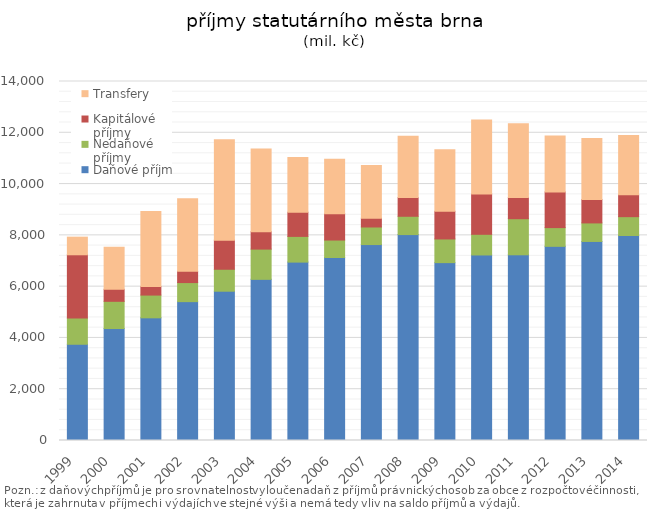
| Category | Daňové příjmy | Nedaňové příjmy | Kapitálové příjmy | Transfery |
|---|---|---|---|---|
| 1999 | 3752.9 | 1019.7 | 2470.1 | 687.4 |
| 2000 | 4366.332 | 1061.384 | 468.357 | 1642.013 |
| 2001 | 4783.8 | 887.28 | 331.68 | 2928.068 |
| 2002 | 5415 | 743.7 | 439.9 | 2825.5 |
| 2003 | 5821.9 | 856.4 | 1135.5 | 3909.8 |
| 2004 | 6284.367 | 1179.562 | 679.291 | 3220.894 |
| 2005 | 6956.8 | 1002.7 | 941.9 | 2138.2 |
| 2006 | 7136.3 | 681.3 | 1025.9 | 2125.8 |
| 2007 | 7641.04 | 685.219 | 342.106 | 2059.87 |
| 2008 | 8030.3 | 713.9 | 728.4 | 2391.1 |
| 2009 | 6936.6 | 923 | 1077.8 | 2399 |
| 2010 | 7235 | 805.9 | 1575.6 | 2882.1 |
| 2011 | 7242.1 | 1406.9 | 829.3 | 2869.7 |
| 2012 | 7571.9 | 730.5 | 1391.3 | 2182.4 |
| 2013 | 7762.2 | 722.8 | 913.1 | 2374.4 |
| 2014 | 7994 | 735 | 852 | 2312 |